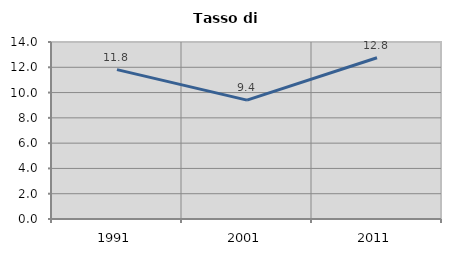
| Category | Tasso di disoccupazione   |
|---|---|
| 1991.0 | 11.817 |
| 2001.0 | 9.405 |
| 2011.0 | 12.754 |